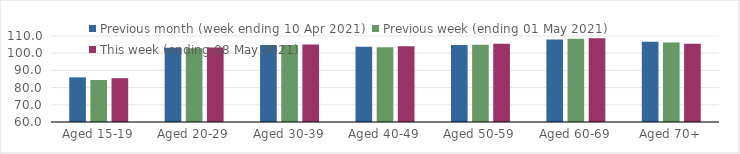
| Category | Previous month (week ending 10 Apr 2021) | Previous week (ending 01 May 2021) | This week (ending 08 May 2021) |
|---|---|---|---|
| Aged 15-19 | 85.95 | 84.41 | 85.46 |
| Aged 20-29 | 103.13 | 102.87 | 103.3 |
| Aged 30-39 | 104.83 | 104.7 | 104.99 |
| Aged 40-49 | 103.79 | 103.51 | 104.02 |
| Aged 50-59 | 104.71 | 104.98 | 105.56 |
| Aged 60-69 | 107.9 | 108.38 | 108.7 |
| Aged 70+ | 106.64 | 106.16 | 105.44 |